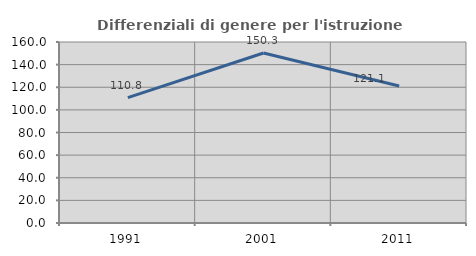
| Category | Differenziali di genere per l'istruzione superiore |
|---|---|
| 1991.0 | 110.84 |
| 2001.0 | 150.271 |
| 2011.0 | 121.109 |